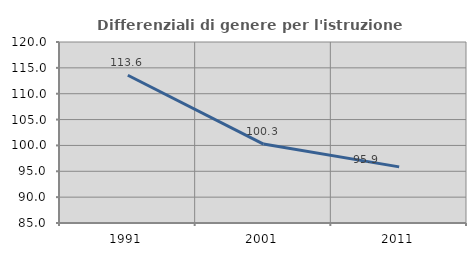
| Category | Differenziali di genere per l'istruzione superiore |
|---|---|
| 1991.0 | 113.577 |
| 2001.0 | 100.257 |
| 2011.0 | 95.856 |